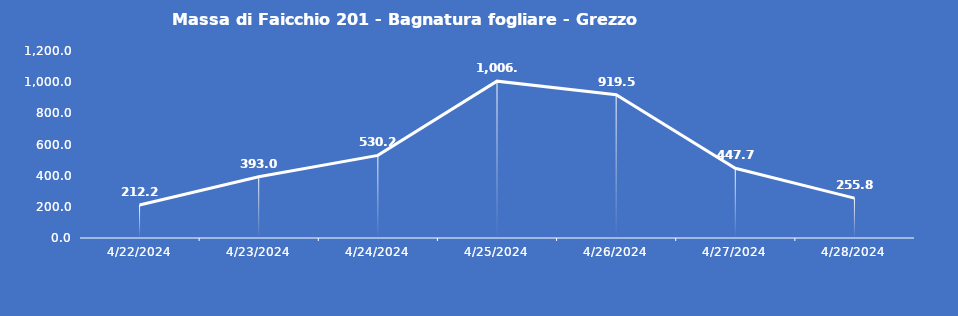
| Category | Massa di Faicchio 201 - Bagnatura fogliare - Grezzo (min) |
|---|---|
| 4/22/24 | 212.2 |
| 4/23/24 | 393 |
| 4/24/24 | 530.2 |
| 4/25/24 | 1006.6 |
| 4/26/24 | 919.5 |
| 4/27/24 | 447.7 |
| 4/28/24 | 255.8 |